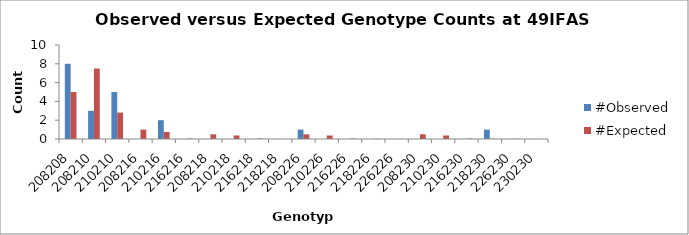
| Category | #Observed | #Expected |
|---|---|---|
| 208208.0 | 8 | 5 |
| 208210.0 | 3 | 7.5 |
| 210210.0 | 5 | 2.812 |
| 208216.0 | 0 | 1 |
| 210216.0 | 2 | 0.75 |
| 216216.0 | 0 | 0.05 |
| 208218.0 | 0 | 0.5 |
| 210218.0 | 0 | 0.375 |
| 216218.0 | 0 | 0.05 |
| 218218.0 | 0 | 0.012 |
| 208226.0 | 1 | 0.5 |
| 210226.0 | 0 | 0.375 |
| 216226.0 | 0 | 0.05 |
| 218226.0 | 0 | 0.025 |
| 226226.0 | 0 | 0.012 |
| 208230.0 | 0 | 0.5 |
| 210230.0 | 0 | 0.375 |
| 216230.0 | 0 | 0.05 |
| 218230.0 | 1 | 0.025 |
| 226230.0 | 0 | 0.025 |
| 230230.0 | 0 | 0.012 |